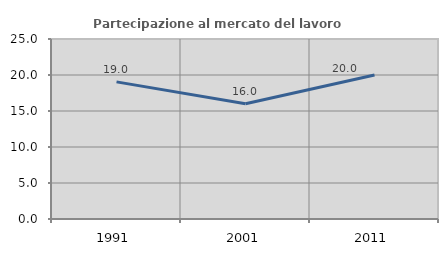
| Category | Partecipazione al mercato del lavoro  femminile |
|---|---|
| 1991.0 | 19.048 |
| 2001.0 | 16 |
| 2011.0 | 20 |